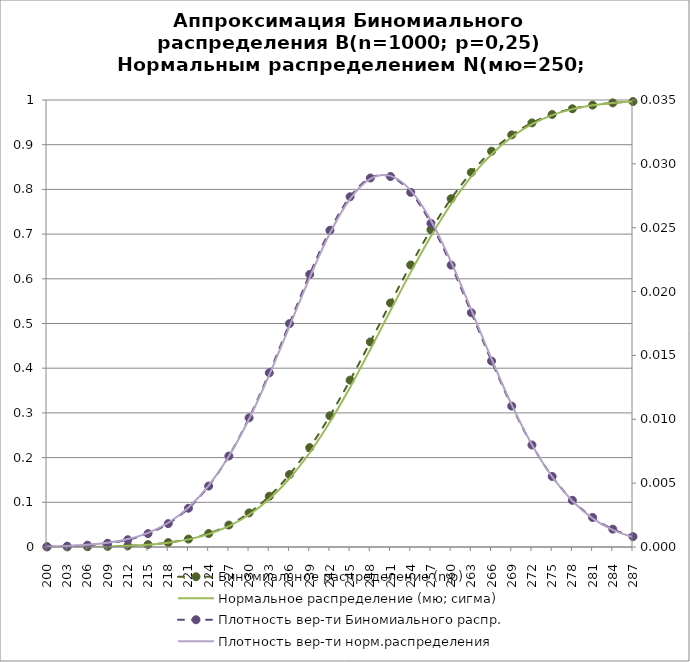
| Category | Биномиальное распределение (n;p) | Нормальное распределение (мю; сигма) |
|---|---|---|
| 200.0 | 0 | 0 |
| 203.0 | 0 | 0 |
| 206.0 | 0.001 | 0.001 |
| 209.0 | 0.001 | 0.001 |
| 212.0 | 0.003 | 0.003 |
| 215.0 | 0.005 | 0.005 |
| 218.0 | 0.01 | 0.01 |
| 221.0 | 0.018 | 0.017 |
| 224.0 | 0.03 | 0.029 |
| 227.0 | 0.049 | 0.047 |
| 230.0 | 0.076 | 0.072 |
| 233.0 | 0.114 | 0.107 |
| 236.0 | 0.162 | 0.153 |
| 239.0 | 0.222 | 0.211 |
| 242.0 | 0.293 | 0.28 |
| 245.0 | 0.373 | 0.358 |
| 248.0 | 0.459 | 0.442 |
| 251.0 | 0.546 | 0.529 |
| 254.0 | 0.631 | 0.615 |
| 257.0 | 0.71 | 0.695 |
| 260.0 | 0.779 | 0.767 |
| 263.0 | 0.838 | 0.829 |
| 266.0 | 0.885 | 0.879 |
| 269.0 | 0.922 | 0.917 |
| 272.0 | 0.949 | 0.946 |
| 275.0 | 0.968 | 0.966 |
| 278.0 | 0.98 | 0.98 |
| 281.0 | 0.989 | 0.988 |
| 284.0 | 0.994 | 0.993 |
| 287.0 | 0.997 | 0.997 |